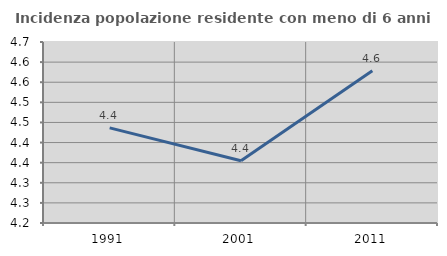
| Category | Incidenza popolazione residente con meno di 6 anni |
|---|---|
| 1991.0 | 4.436 |
| 2001.0 | 4.355 |
| 2011.0 | 4.578 |